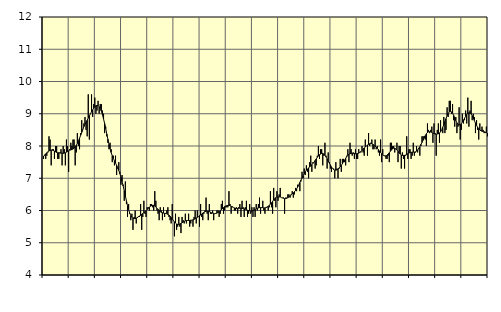
| Category | Byggverksamhet, SNI 41-43 | Series 1 |
|---|---|---|
| nan | 7.6 | 7.69 |
| 87.0 | 7.7 | 7.72 |
| 87.0 | 7.6 | 7.76 |
| 87.0 | 7.7 | 7.79 |
| 87.0 | 7.8 | 7.82 |
| 87.0 | 8.3 | 7.85 |
| 87.0 | 8.2 | 7.86 |
| 87.0 | 7.4 | 7.87 |
| 87.0 | 7.9 | 7.87 |
| 87.0 | 7.9 | 7.86 |
| 87.0 | 7.6 | 7.84 |
| 87.0 | 8 | 7.82 |
| nan | 8 | 7.8 |
| 88.0 | 7.6 | 7.79 |
| 88.0 | 7.6 | 7.79 |
| 88.0 | 7.8 | 7.78 |
| 88.0 | 7.9 | 7.78 |
| 88.0 | 7.4 | 7.78 |
| 88.0 | 8 | 7.77 |
| 88.0 | 7.9 | 7.78 |
| 88.0 | 7.4 | 7.79 |
| 88.0 | 8.2 | 7.81 |
| 88.0 | 8 | 7.83 |
| 88.0 | 7.2 | 7.85 |
| nan | 7.9 | 7.87 |
| 89.0 | 8.1 | 7.88 |
| 89.0 | 8 | 7.89 |
| 89.0 | 8.2 | 7.91 |
| 89.0 | 8.2 | 7.93 |
| 89.0 | 7.4 | 7.97 |
| 89.0 | 7.8 | 8.02 |
| 89.0 | 8.4 | 8.08 |
| 89.0 | 8 | 8.16 |
| 89.0 | 7.9 | 8.24 |
| 89.0 | 8.4 | 8.33 |
| 89.0 | 8.8 | 8.42 |
| nan | 8.5 | 8.51 |
| 90.0 | 8.7 | 8.6 |
| 90.0 | 8.9 | 8.67 |
| 90.0 | 8.5 | 8.74 |
| 90.0 | 8.3 | 8.8 |
| 90.0 | 9.6 | 8.87 |
| 90.0 | 8.2 | 8.93 |
| 90.0 | 9 | 9 |
| 90.0 | 9.6 | 9.06 |
| 90.0 | 8.9 | 9.12 |
| 90.0 | 9.3 | 9.18 |
| 90.0 | 9.5 | 9.22 |
| nan | 9 | 9.25 |
| 91.0 | 9.1 | 9.26 |
| 91.0 | 9.4 | 9.25 |
| 91.0 | 9 | 9.22 |
| 91.0 | 9.3 | 9.16 |
| 91.0 | 9.3 | 9.08 |
| 91.0 | 9.1 | 8.97 |
| 91.0 | 9 | 8.84 |
| 91.0 | 8.4 | 8.7 |
| 91.0 | 8.6 | 8.54 |
| 91.0 | 8.3 | 8.37 |
| 91.0 | 8.1 | 8.21 |
| nan | 7.9 | 8.05 |
| 92.0 | 8.1 | 7.92 |
| 92.0 | 7.9 | 7.8 |
| 92.0 | 7.5 | 7.7 |
| 92.0 | 7.7 | 7.62 |
| 92.0 | 7.4 | 7.54 |
| 92.0 | 7.7 | 7.47 |
| 92.0 | 7.1 | 7.4 |
| 92.0 | 7.3 | 7.33 |
| 92.0 | 7.5 | 7.24 |
| 92.0 | 7.2 | 7.14 |
| 92.0 | 6.8 | 7.03 |
| nan | 7.1 | 6.9 |
| 93.0 | 6.8 | 6.76 |
| 93.0 | 6.3 | 6.61 |
| 93.0 | 6.9 | 6.45 |
| 93.0 | 6.2 | 6.3 |
| 93.0 | 5.8 | 6.15 |
| 93.0 | 6.2 | 6.03 |
| 93.0 | 5.9 | 5.92 |
| 93.0 | 5.7 | 5.84 |
| 93.0 | 5.9 | 5.79 |
| 93.0 | 5.4 | 5.76 |
| 93.0 | 5.8 | 5.75 |
| nan | 6 | 5.75 |
| 94.0 | 5.6 | 5.76 |
| 94.0 | 5.8 | 5.78 |
| 94.0 | 5.8 | 5.81 |
| 94.0 | 5.8 | 5.83 |
| 94.0 | 6.2 | 5.85 |
| 94.0 | 5.4 | 5.88 |
| 94.0 | 5.8 | 5.91 |
| 94.0 | 6.3 | 5.93 |
| 94.0 | 5.9 | 5.96 |
| 94.0 | 5.8 | 5.99 |
| 94.0 | 6.1 | 6.03 |
| nan | 6.1 | 6.07 |
| 95.0 | 6 | 6.1 |
| 95.0 | 6.2 | 6.13 |
| 95.0 | 6.2 | 6.15 |
| 95.0 | 6.1 | 6.16 |
| 95.0 | 6 | 6.16 |
| 95.0 | 6.6 | 6.14 |
| 95.0 | 6.3 | 6.11 |
| 95.0 | 6 | 6.07 |
| 95.0 | 5.9 | 6.03 |
| 95.0 | 5.7 | 6 |
| 95.0 | 6.1 | 5.97 |
| nan | 6 | 5.94 |
| 96.0 | 5.7 | 5.93 |
| 96.0 | 6.1 | 5.92 |
| 96.0 | 5.8 | 5.91 |
| 96.0 | 5.9 | 5.91 |
| 96.0 | 6 | 5.9 |
| 96.0 | 6.1 | 5.88 |
| 96.0 | 5.8 | 5.86 |
| 96.0 | 5.7 | 5.82 |
| 96.0 | 5.6 | 5.78 |
| 96.0 | 6.2 | 5.74 |
| 96.0 | 5.7 | 5.69 |
| nan | 5.2 | 5.65 |
| 97.0 | 5.9 | 5.61 |
| 97.0 | 5.4 | 5.58 |
| 97.0 | 5.5 | 5.57 |
| 97.0 | 5.8 | 5.57 |
| 97.0 | 5.5 | 5.58 |
| 97.0 | 5.3 | 5.6 |
| 97.0 | 5.8 | 5.62 |
| 97.0 | 5.7 | 5.64 |
| 97.0 | 5.6 | 5.66 |
| 97.0 | 5.9 | 5.68 |
| 97.0 | 5.6 | 5.69 |
| nan | 5.7 | 5.69 |
| 98.0 | 5.9 | 5.69 |
| 98.0 | 5.5 | 5.69 |
| 98.0 | 5.6 | 5.7 |
| 98.0 | 5.7 | 5.7 |
| 98.0 | 5.5 | 5.71 |
| 98.0 | 5.8 | 5.73 |
| 98.0 | 6 | 5.74 |
| 98.0 | 5.6 | 5.77 |
| 98.0 | 6 | 5.79 |
| 98.0 | 5.8 | 5.81 |
| 98.0 | 5.5 | 5.84 |
| nan | 6.2 | 5.86 |
| 99.0 | 5.8 | 5.89 |
| 99.0 | 5.7 | 5.92 |
| 99.0 | 5.9 | 5.94 |
| 99.0 | 6 | 5.96 |
| 99.0 | 6.4 | 5.98 |
| 99.0 | 5.9 | 5.98 |
| 99.0 | 5.7 | 5.98 |
| 99.0 | 6.2 | 5.97 |
| 99.0 | 5.9 | 5.95 |
| 99.0 | 5.9 | 5.93 |
| 99.0 | 6 | 5.92 |
| nan | 5.7 | 5.91 |
| 0.0 | 5.9 | 5.9 |
| 0.0 | 5.9 | 5.91 |
| 0.0 | 6 | 5.92 |
| 0.0 | 6 | 5.94 |
| 0.0 | 5.8 | 5.97 |
| 0.0 | 5.9 | 5.99 |
| 0.0 | 6.2 | 6.02 |
| 0.0 | 6.3 | 6.06 |
| 0.0 | 5.9 | 6.09 |
| 0.0 | 6 | 6.12 |
| 0.0 | 6.1 | 6.14 |
| nan | 6.1 | 6.15 |
| 1.0 | 6.1 | 6.16 |
| 1.0 | 6.6 | 6.16 |
| 1.0 | 6.2 | 6.15 |
| 1.0 | 5.9 | 6.13 |
| 1.0 | 6.1 | 6.12 |
| 1.0 | 6.1 | 6.1 |
| 1.0 | 6 | 6.08 |
| 1.0 | 6 | 6.07 |
| 1.0 | 6.1 | 6.06 |
| 1.0 | 5.9 | 6.06 |
| 1.0 | 6.1 | 6.07 |
| nan | 6.2 | 6.07 |
| 2.0 | 5.8 | 6.07 |
| 2.0 | 6.3 | 6.07 |
| 2.0 | 6.1 | 6.06 |
| 2.0 | 5.8 | 6.05 |
| 2.0 | 6.1 | 6.04 |
| 2.0 | 6.3 | 6.02 |
| 2.0 | 5.8 | 6.01 |
| 2.0 | 5.9 | 6 |
| 2.0 | 6.2 | 5.99 |
| 2.0 | 5.9 | 5.98 |
| 2.0 | 6.1 | 5.98 |
| nan | 5.8 | 5.99 |
| 3.0 | 6.1 | 6.01 |
| 3.0 | 5.8 | 6.03 |
| 3.0 | 6.2 | 6.05 |
| 3.0 | 6 | 6.07 |
| 3.0 | 6.2 | 6.08 |
| 3.0 | 6.4 | 6.09 |
| 3.0 | 5.9 | 6.09 |
| 3.0 | 6.1 | 6.09 |
| 3.0 | 6.3 | 6.09 |
| 3.0 | 6 | 6.08 |
| 3.0 | 5.9 | 6.08 |
| nan | 6.1 | 6.09 |
| 4.0 | 6.1 | 6.11 |
| 4.0 | 6 | 6.13 |
| 4.0 | 6.1 | 6.16 |
| 4.0 | 6.6 | 6.2 |
| 4.0 | 6.1 | 6.24 |
| 4.0 | 5.9 | 6.28 |
| 4.0 | 6.7 | 6.33 |
| 4.0 | 6.3 | 6.37 |
| 4.0 | 6.1 | 6.4 |
| 4.0 | 6.6 | 6.42 |
| 4.0 | 6.3 | 6.42 |
| nan | 6.5 | 6.42 |
| 5.0 | 6.7 | 6.42 |
| 5.0 | 6.4 | 6.4 |
| 5.0 | 6.4 | 6.39 |
| 5.0 | 6.4 | 6.38 |
| 5.0 | 5.9 | 6.37 |
| 5.0 | 6.4 | 6.37 |
| 5.0 | 6.4 | 6.38 |
| 5.0 | 6.5 | 6.4 |
| 5.0 | 6.5 | 6.42 |
| 5.0 | 6.4 | 6.45 |
| 5.0 | 6.5 | 6.48 |
| nan | 6.6 | 6.51 |
| 6.0 | 6.4 | 6.55 |
| 6.0 | 6.5 | 6.58 |
| 6.0 | 6.7 | 6.62 |
| 6.0 | 6.6 | 6.67 |
| 6.0 | 6.8 | 6.73 |
| 6.0 | 6.8 | 6.8 |
| 6.0 | 6.6 | 6.87 |
| 6.0 | 6.9 | 6.94 |
| 6.0 | 7.2 | 7.01 |
| 6.0 | 7 | 7.08 |
| 6.0 | 7.3 | 7.14 |
| nan | 7.1 | 7.2 |
| 7.0 | 7.4 | 7.25 |
| 7.0 | 7.2 | 7.29 |
| 7.0 | 7 | 7.32 |
| 7.0 | 7.5 | 7.35 |
| 7.0 | 7.7 | 7.38 |
| 7.0 | 7.2 | 7.42 |
| 7.0 | 7.5 | 7.46 |
| 7.0 | 7.5 | 7.5 |
| 7.0 | 7.3 | 7.55 |
| 7.0 | 7.4 | 7.6 |
| 7.0 | 7.7 | 7.65 |
| nan | 8 | 7.69 |
| 8.0 | 7.6 | 7.73 |
| 8.0 | 7.9 | 7.75 |
| 8.0 | 7.9 | 7.77 |
| 8.0 | 7.4 | 7.77 |
| 8.0 | 7.7 | 7.75 |
| 8.0 | 8.1 | 7.71 |
| 8.0 | 7.7 | 7.66 |
| 8.0 | 7.3 | 7.6 |
| 8.0 | 7.8 | 7.54 |
| 8.0 | 7.5 | 7.47 |
| 8.0 | 7.3 | 7.41 |
| nan | 7.2 | 7.35 |
| 9.0 | 7.3 | 7.3 |
| 9.0 | 7.3 | 7.27 |
| 9.0 | 7 | 7.25 |
| 9.0 | 7.5 | 7.25 |
| 9.0 | 7.3 | 7.26 |
| 9.0 | 7 | 7.29 |
| 9.0 | 7.3 | 7.32 |
| 9.0 | 7.6 | 7.36 |
| 9.0 | 7.2 | 7.4 |
| 9.0 | 7.6 | 7.45 |
| 9.0 | 7.6 | 7.51 |
| nan | 7.5 | 7.56 |
| 10.0 | 7.4 | 7.62 |
| 10.0 | 7.7 | 7.67 |
| 10.0 | 7.9 | 7.71 |
| 10.0 | 7.5 | 7.75 |
| 10.0 | 8.1 | 7.76 |
| 10.0 | 7.9 | 7.77 |
| 10.0 | 7.7 | 7.78 |
| 10.0 | 7.8 | 7.77 |
| 10.0 | 7.6 | 7.77 |
| 10.0 | 7.9 | 7.76 |
| 10.0 | 7.6 | 7.76 |
| nan | 7.6 | 7.77 |
| 11.0 | 7.9 | 7.78 |
| 11.0 | 7.8 | 7.8 |
| 11.0 | 7.8 | 7.83 |
| 11.0 | 8 | 7.86 |
| 11.0 | 7.8 | 7.9 |
| 11.0 | 7.7 | 7.94 |
| 11.0 | 8.2 | 7.97 |
| 11.0 | 8 | 8 |
| 11.0 | 7.7 | 8.03 |
| 11.0 | 8.4 | 8.05 |
| 11.0 | 8 | 8.07 |
| nan | 8.1 | 8.07 |
| 12.0 | 8.2 | 8.07 |
| 12.0 | 7.9 | 8.05 |
| 12.0 | 7.9 | 8.03 |
| 12.0 | 8.2 | 8 |
| 12.0 | 7.9 | 7.96 |
| 12.0 | 8 | 7.93 |
| 12.0 | 7.8 | 7.89 |
| 12.0 | 7.7 | 7.84 |
| 12.0 | 8.2 | 7.8 |
| 12.0 | 7.5 | 7.76 |
| 12.0 | 7.9 | 7.72 |
| nan | 7.7 | 7.7 |
| 13.0 | 7.7 | 7.69 |
| 13.0 | 7.6 | 7.69 |
| 13.0 | 7.6 | 7.72 |
| 13.0 | 7.7 | 7.75 |
| 13.0 | 7.5 | 7.79 |
| 13.0 | 8.1 | 7.84 |
| 13.0 | 8.1 | 7.88 |
| 13.0 | 8 | 7.91 |
| 13.0 | 8 | 7.93 |
| 13.0 | 7.8 | 7.93 |
| 13.0 | 7.9 | 7.91 |
| nan | 8.1 | 7.88 |
| 14.0 | 7.5 | 7.83 |
| 14.0 | 8 | 7.79 |
| 14.0 | 8 | 7.75 |
| 14.0 | 7.3 | 7.72 |
| 14.0 | 7.8 | 7.71 |
| 14.0 | 7.6 | 7.71 |
| 14.0 | 7.3 | 7.71 |
| 14.0 | 7.7 | 7.72 |
| 14.0 | 8.3 | 7.74 |
| 14.0 | 7.6 | 7.76 |
| 14.0 | 7.9 | 7.78 |
| nan | 7.9 | 7.8 |
| 15.0 | 7.6 | 7.8 |
| 15.0 | 7.7 | 7.81 |
| 15.0 | 8.1 | 7.81 |
| 15.0 | 7.7 | 7.81 |
| 15.0 | 7.8 | 7.82 |
| 15.0 | 8 | 7.84 |
| 15.0 | 7.8 | 7.88 |
| 15.0 | 7.9 | 7.93 |
| 15.0 | 7.7 | 7.98 |
| 15.0 | 8 | 8.05 |
| 15.0 | 8.3 | 8.11 |
| nan | 8.3 | 8.18 |
| 16.0 | 8.3 | 8.25 |
| 16.0 | 8.2 | 8.32 |
| 16.0 | 8 | 8.38 |
| 16.0 | 8.7 | 8.42 |
| 16.0 | 8.5 | 8.44 |
| 16.0 | 8.4 | 8.44 |
| 16.0 | 8.5 | 8.44 |
| 16.0 | 8.6 | 8.42 |
| 16.0 | 8.1 | 8.4 |
| 16.0 | 8.7 | 8.39 |
| 16.0 | 8.4 | 8.37 |
| nan | 7.7 | 8.36 |
| 17.0 | 8.5 | 8.37 |
| 17.0 | 8.7 | 8.38 |
| 17.0 | 8.1 | 8.4 |
| 17.0 | 8.8 | 8.44 |
| 17.0 | 8.5 | 8.5 |
| 17.0 | 8.4 | 8.58 |
| 17.0 | 8.9 | 8.66 |
| 17.0 | 8.4 | 8.76 |
| 17.0 | 8.5 | 8.85 |
| 17.0 | 9.2 | 8.94 |
| 17.0 | 8.9 | 9.01 |
| nan | 9.4 | 9.06 |
| 18.0 | 9.4 | 9.07 |
| 18.0 | 9 | 9.06 |
| 18.0 | 9.3 | 9.02 |
| 18.0 | 8.8 | 8.95 |
| 18.0 | 8.6 | 8.87 |
| 18.0 | 8.9 | 8.79 |
| 18.0 | 8.4 | 8.72 |
| 18.0 | 8.6 | 8.67 |
| 18.0 | 9.2 | 8.65 |
| 18.0 | 8.2 | 8.66 |
| 18.0 | 8.5 | 8.69 |
| nan | 9 | 8.74 |
| 19.0 | 8.7 | 8.8 |
| 19.0 | 8.8 | 8.86 |
| 19.0 | 9.1 | 8.92 |
| 19.0 | 8.7 | 8.98 |
| 19.0 | 9.5 | 9.01 |
| 19.0 | 8.6 | 9.03 |
| 19.0 | 9.1 | 9.02 |
| 19.0 | 9.4 | 8.99 |
| 19.0 | 8.8 | 8.94 |
| 19.0 | 9 | 8.87 |
| 19.0 | 8.9 | 8.79 |
| nan | 8.4 | 8.71 |
| 20.0 | 8.8 | 8.64 |
| 20.0 | 8.5 | 8.58 |
| 20.0 | 8.2 | 8.53 |
| 20.0 | 8.7 | 8.5 |
| 20.0 | 8.5 | 8.47 |
| 20.0 | 8.6 | 8.46 |
| 20.0 | 8.5 | 8.45 |
| 20.0 | 8.4 | 8.44 |
| 20.0 | 8.4 | 8.43 |
| 20.0 | 8.6 | 8.42 |
| 20.0 | 8.3 | 8.4 |